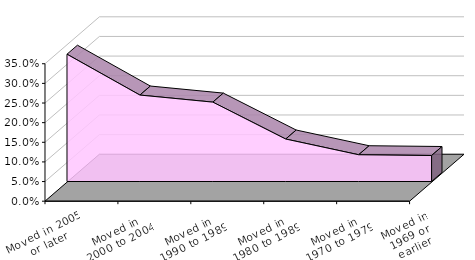
| Category | Monroe |
|---|---|
| Moved in 2005 or later | 0.326 |
| Moved in 2000 to 2004 | 0.222 |
| Moved in 1990 to 1989 | 0.204 |
| Moved in 1980 to 1989 | 0.11 |
| Moved in 1970 to 1979 | 0.07 |
| Moved in 1969 or earlier | 0.068 |